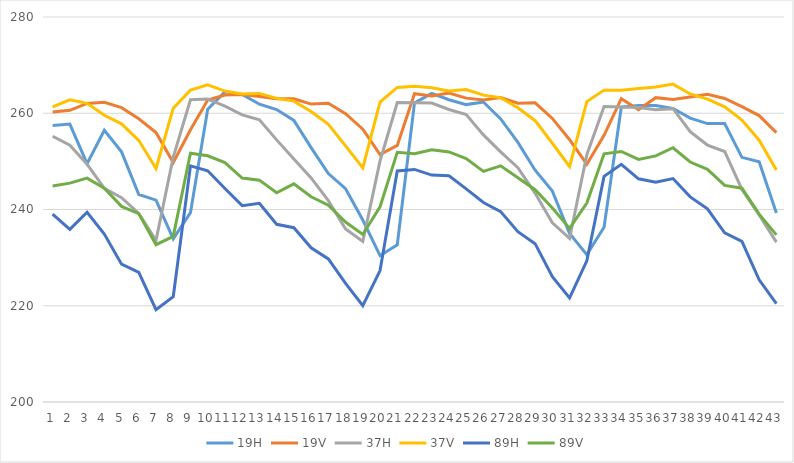
| Category | 19H | 19V | 37H | 37V | 89H | 89V |
|---|---|---|---|---|---|---|
| 0 | 257.478 | 260.254 | 255.214 | 261.322 | 239.033 | 244.884 |
| 1 | 257.747 | 260.599 | 253.354 | 262.787 | 235.87 | 245.479 |
| 2 | 249.523 | 262.05 | 249.419 | 262.059 | 239.436 | 246.517 |
| 3 | 256.451 | 262.285 | 244.376 | 259.591 | 234.899 | 244.425 |
| 4 | 251.981 | 261.162 | 242.463 | 257.796 | 228.641 | 240.647 |
| 5 | 243.121 | 258.852 | 239.167 | 254.371 | 226.941 | 239.156 |
| 6 | 241.952 | 256.004 | 233.591 | 248.513 | 219.179 | 232.691 |
| 7 | 233.886 | 249.761 | 250.89 | 261.054 | 221.897 | 234.416 |
| 8 | 239.358 | 256.578 | 262.799 | 264.793 | 249.065 | 251.679 |
| 9 | 260.828 | 262.749 | 262.947 | 265.926 | 248.055 | 251.161 |
| 10 | 264.44 | 263.777 | 261.469 | 264.608 | 244.357 | 249.757 |
| 11 | 263.92 | 263.894 | 259.668 | 264.008 | 240.797 | 246.54 |
| 12 | 261.879 | 263.469 | 258.644 | 264.127 | 241.281 | 246.097 |
| 13 | 260.764 | 263.011 | 254.466 | 263.096 | 236.923 | 243.481 |
| 14 | 258.52 | 262.99 | 250.486 | 262.522 | 236.225 | 245.34 |
| 15 | 252.861 | 261.909 | 246.562 | 260.35 | 232.055 | 242.643 |
| 16 | 247.454 | 262.074 | 241.83 | 257.693 | 229.734 | 240.886 |
| 17 | 244.331 | 259.909 | 235.952 | 253.208 | 224.664 | 237.395 |
| 18 | 237.811 | 256.698 | 233.345 | 248.63 | 220.021 | 234.82 |
| 19 | 230.411 | 251.398 | 250.081 | 262.325 | 227.306 | 240.56 |
| 20 | 232.675 | 253.323 | 262.218 | 265.373 | 248.003 | 251.899 |
| 21 | 262.149 | 264.061 | 262.16 | 265.592 | 248.323 | 251.586 |
| 22 | 264.126 | 263.607 | 262.134 | 265.288 | 247.151 | 252.417 |
| 23 | 262.814 | 264.19 | 260.774 | 264.635 | 247.017 | 251.959 |
| 24 | 261.797 | 263.143 | 259.71 | 264.924 | 244.284 | 250.586 |
| 25 | 262.338 | 262.779 | 255.503 | 263.763 | 241.457 | 247.912 |
| 26 | 258.819 | 263.275 | 251.97 | 263.225 | 239.555 | 249.068 |
| 27 | 253.939 | 262.086 | 248.682 | 261.157 | 235.383 | 246.589 |
| 28 | 248.162 | 262.158 | 243.367 | 258.456 | 232.898 | 244.115 |
| 29 | 243.815 | 258.927 | 237.242 | 253.768 | 226.051 | 240.319 |
| 30 | 235.017 | 254.5 | 233.985 | 248.899 | 221.643 | 236.08 |
| 31 | 230.629 | 249.423 | 251.382 | 262.416 | 229.332 | 241.339 |
| 32 | 236.298 | 255.406 | 261.419 | 264.805 | 246.881 | 251.568 |
| 33 | 261.261 | 263.031 | 261.321 | 264.805 | 249.398 | 252.06 |
| 34 | 261.611 | 260.735 | 261.178 | 265.162 | 246.375 | 250.408 |
| 35 | 261.612 | 263.239 | 260.748 | 265.465 | 245.645 | 251.148 |
| 36 | 260.995 | 262.883 | 260.955 | 266.051 | 246.422 | 252.833 |
| 37 | 258.982 | 263.393 | 256.192 | 264.014 | 242.624 | 249.866 |
| 38 | 257.858 | 263.94 | 253.391 | 262.936 | 240.15 | 248.347 |
| 39 | 257.861 | 263.067 | 252.057 | 261.318 | 235.131 | 245.016 |
| 40 | 250.84 | 261.375 | 244.168 | 258.571 | 233.382 | 244.42 |
| 41 | 249.905 | 259.518 | 238.875 | 254.391 | 225.383 | 239.044 |
| 42 | 239.253 | 255.979 | 233.216 | 248.192 | 220.457 | 234.727 |